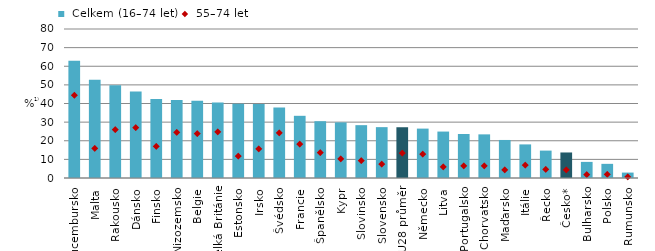
| Category |  Celkem (16–74 let) |
|---|---|
| Lucembursko | 63.008 |
| Malta | 52.783 |
| Rakousko | 49.75 |
| Dánsko | 46.458 |
| Finsko | 42.438 |
| Nizozemsko | 41.904 |
| Belgie | 41.536 |
| Velká Británie | 40.559 |
| Estonsko | 39.89 |
| Irsko | 39.753 |
| Švédsko | 37.808 |
| Francie | 33.392 |
| Španělsko | 30.496 |
| Kypr | 29.853 |
| Slovinsko | 28.372 |
| Slovensko | 27.308 |
| EU28 průměr | 27.255 |
| Německo | 26.52 |
| Litva | 24.932 |
| Portugalsko | 23.624 |
| Chorvatsko | 23.43 |
| Maďarsko | 20.422 |
| Itálie | 18.04 |
| Řecko | 14.711 |
| Česko* | 13.706 |
| Bulharsko | 8.65 |
| Polsko | 7.6 |
| Rumunsko | 2.912 |